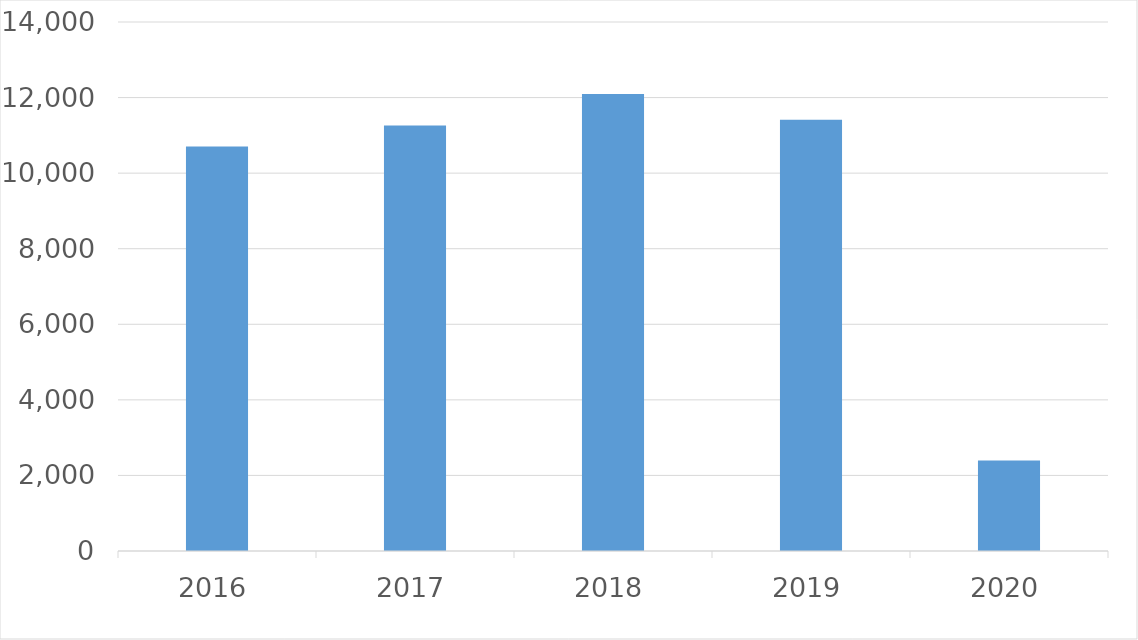
| Category | Series 0 |
|---|---|
| 2016 | 10705 |
| 2017 | 11262 |
| 2018 | 12093 |
| 2019 | 11414 |
| 2020 | 2398 |